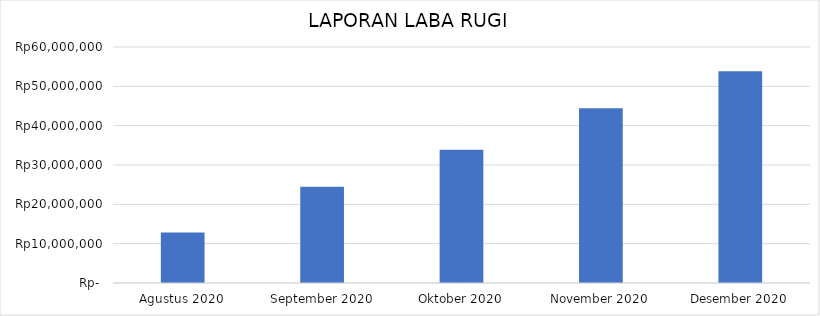
| Category | Series 0 |
|---|---|
| Agustus 2020 | 12850000 |
| September 2020 | 24450000 |
| Oktober 2020 | 33850000 |
| November 2020 | 44450000 |
| Desember 2020 | 53850000 |